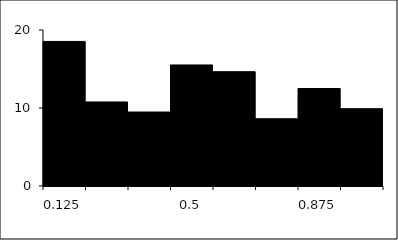
| Category | Series 1 |
|---|---|
| 0.125 | 18.534 |
| 0.25 | 10.776 |
| 0.375 | 9.483 |
| 0.5 | 15.517 |
| 0.625 | 14.655 |
| 0.75 | 8.621 |
| 0.875 | 12.5 |
| 1.0 | 9.914 |